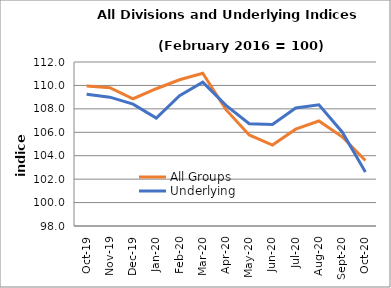
| Category | All Groups | Underlying |
|---|---|---|
| 2019-10-01 | 109.943 | 109.256 |
| 2019-11-01 | 109.811 | 108.998 |
| 2019-12-01 | 108.864 | 108.4 |
| 2020-01-01 | 109.718 | 107.211 |
| 2020-02-01 | 110.483 | 109.121 |
| 2020-03-01 | 111.043 | 110.276 |
| 2020-04-01 | 107.93 | 108.297 |
| 2020-05-01 | 105.77 | 106.735 |
| 2020-06-01 | 104.913 | 106.661 |
| 2020-07-01 | 106.265 | 108.077 |
| 2020-08-01 | 106.963 | 108.349 |
| 2020-09-01 | 105.614 | 106.027 |
| 2020-10-01 | 103.588 | 102.619 |